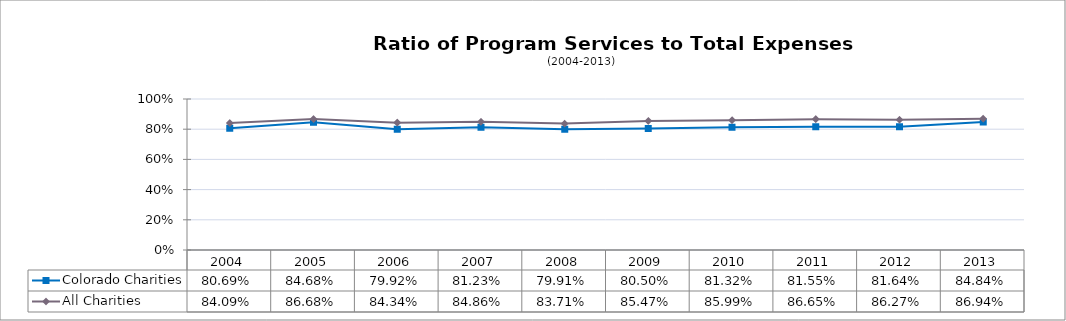
| Category | Colorado Charities | All Charities |
|---|---|---|
| 2004 | 0.807 | 0.841 |
| 2005 | 0.847 | 0.867 |
| 2006 | 0.799 | 0.843 |
| 2007 | 0.812 | 0.849 |
| 2008 | 0.799 | 0.837 |
| 2009 | 0.805 | 0.855 |
| 2010 | 0.813 | 0.86 |
| 2011 | 0.816 | 0.866 |
| 2012 | 0.816 | 0.863 |
| 2013 | 0.848 | 0.869 |